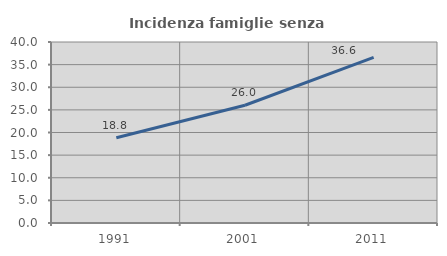
| Category | Incidenza famiglie senza nuclei |
|---|---|
| 1991.0 | 18.825 |
| 2001.0 | 26.023 |
| 2011.0 | 36.598 |